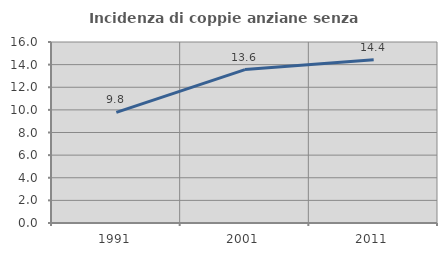
| Category | Incidenza di coppie anziane senza figli  |
|---|---|
| 1991.0 | 9.784 |
| 2001.0 | 13.561 |
| 2011.0 | 14.423 |